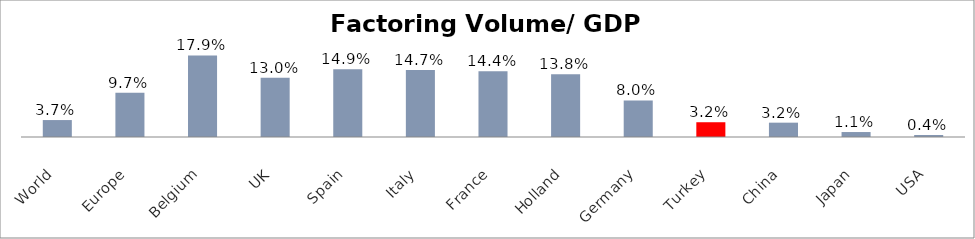
| Category | Factoring Volume/ GDP (%) |
|---|---|
| World | 0.037 |
| Europe | 0.097 |
| Belgium | 0.179 |
| UK | 0.13 |
| Spain | 0.149 |
| Italy | 0.147 |
| France | 0.144 |
| Holland | 0.138 |
| Germany | 0.08 |
| Turkey | 0.032 |
| China | 0.032 |
| Japan | 0.011 |
| USA | 0.004 |